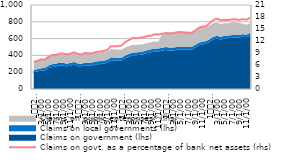
| Category | Claims on govt. as a percentage of bank net assets (rhs) |
|---|---|
| 0 | 6.839 |
| 1900-01-01 | 7.017 |
| 1900-01-02 | 7.418 |
| 1900-01-03 | 7.364 |
| 1900-01-04 | 8.042 |
| 1900-01-05 | 8.485 |
| 1900-01-06 | 8.513 |
| 1900-01-07 | 8.834 |
| 1900-01-08 | 8.869 |
| 1900-01-09 | 8.659 |
| 1900-01-10 | 8.863 |
| 1900-01-11 | 9.193 |
| 1900-01-12 | 8.797 |
| 1900-01-13 | 8.62 |
| 1900-01-14 | 9.029 |
| 1900-01-15 | 8.913 |
| 1900-01-16 | 8.913 |
| 1900-01-17 | 9.266 |
| 1900-01-18 | 9.359 |
| 1900-01-19 | 9.5 |
| 1900-01-20 | 9.732 |
| 1900-01-21 | 10.661 |
| 1900-01-22 | 10.684 |
| 1900-01-23 | 10.671 |
| 1900-01-24 | 10.916 |
| 1900-01-25 | 11.783 |
| 1900-01-26 | 12.28 |
| 1900-01-27 | 12.763 |
| 1900-01-28 | 12.665 |
| 1900-01-29 | 12.836 |
| 1900-01-30 | 12.957 |
| 1900-01-31 | 13.236 |
| 1900-02-01 | 13.344 |
| 1900-02-02 | 13.689 |
| 1900-02-03 | 13.61 |
| 1900-02-04 | 13.823 |
| 1900-02-05 | 13.97 |
| 1900-02-06 | 13.925 |
| 1900-02-07 | 13.914 |
| 1900-02-08 | 14.155 |
| 1900-02-09 | 14.225 |
| 1900-02-10 | 14.009 |
| 1900-02-11 | 14.052 |
| 1900-02-12 | 13.985 |
| 1900-02-13 | 14.637 |
| 1900-02-14 | 15.313 |
| 1900-02-15 | 15.622 |
| 1900-02-16 | 15.712 |
| 1900-02-17 | 16.515 |
| 1900-02-18 | 17.298 |
| 1900-02-19 | 17.568 |
| 1900-02-20 | 17.155 |
| 1900-02-21 | 17.245 |
| 1900-02-22 | 17.242 |
| 1900-02-23 | 17.401 |
| 1900-02-24 | 17.435 |
| 1900-02-25 | 17.262 |
| 1900-02-26 | 17.456 |
| 1900-02-27 | 17.319 |
| 1900-02-28 | 17.757 |